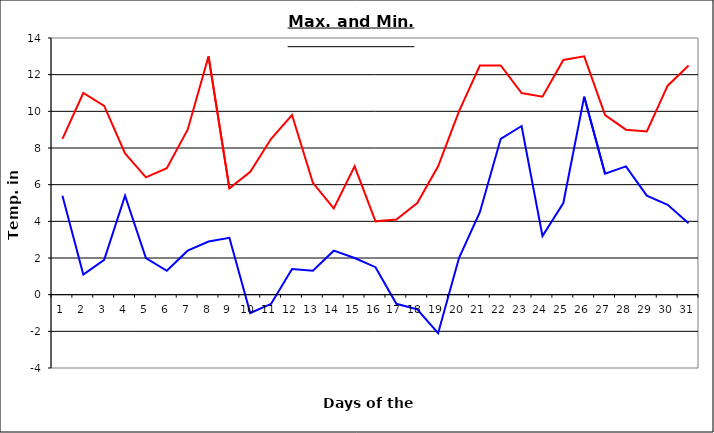
| Category | Series 0 | Series 1 |
|---|---|---|
| 0 | 8.5 | 5.4 |
| 1 | 11 | 1.1 |
| 2 | 10.3 | 1.9 |
| 3 | 7.7 | 5.4 |
| 4 | 6.4 | 2 |
| 5 | 6.9 | 1.3 |
| 6 | 9 | 2.4 |
| 7 | 13 | 2.9 |
| 8 | 5.8 | 3.1 |
| 9 | 6.7 | -1 |
| 10 | 8.5 | -0.5 |
| 11 | 9.8 | 1.4 |
| 12 | 6.1 | 1.3 |
| 13 | 4.7 | 2.4 |
| 14 | 7 | 2 |
| 15 | 4 | 1.5 |
| 16 | 4.1 | -0.5 |
| 17 | 5 | -0.8 |
| 18 | 7 | -2.1 |
| 19 | 10 | 2 |
| 20 | 12.5 | 4.5 |
| 21 | 12.5 | 8.5 |
| 22 | 11 | 9.2 |
| 23 | 10.8 | 3.2 |
| 24 | 12.8 | 5 |
| 25 | 13 | 10.8 |
| 26 | 9.8 | 6.6 |
| 27 | 9 | 7 |
| 28 | 8.9 | 5.4 |
| 29 | 11.4 | 4.9 |
| 30 | 12.5 | 3.9 |